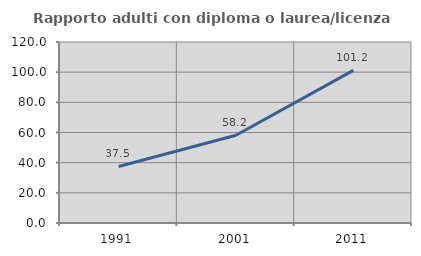
| Category | Rapporto adulti con diploma o laurea/licenza media  |
|---|---|
| 1991.0 | 37.5 |
| 2001.0 | 58.163 |
| 2011.0 | 101.163 |